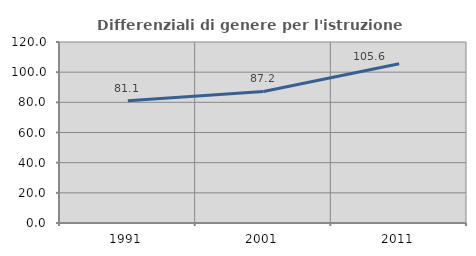
| Category | Differenziali di genere per l'istruzione superiore |
|---|---|
| 1991.0 | 81.065 |
| 2001.0 | 87.189 |
| 2011.0 | 105.566 |